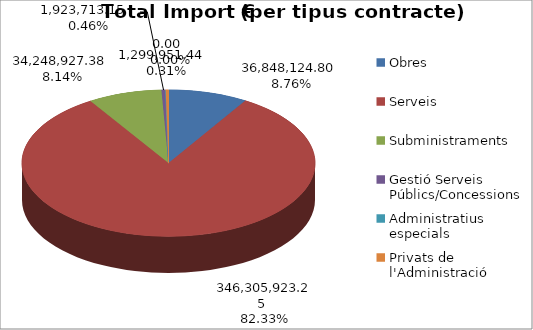
| Category | TOTALS per tipus contracte Total Import (€) | TOTALS per tipus contracte % total import | Tipus de contracte | TOTALS per tipus contracte Nombre Total Contractes | TOTALS per tipus contracte % total contractes |
|---|---|---|---|---|---|
| Obres | 36848124.8 | 0.088 |  | 734 | 0.056 |
| Serveis | 346305923.25 | 0.823 |  | 10437 | 0.801 |
| Subministraments | 34248927.38 | 0.081 |  | 1843 | 0.141 |
| Gestió Serveis Públics/Concessions | 1923713.15 | 0.005 |  | 16 | 0.001 |
| Administratius especials | 0 | 0 |  | 0 | 0 |
| Privats de l'Administració | 1299951.44 | 0.003 |  | 8 | 0.001 |